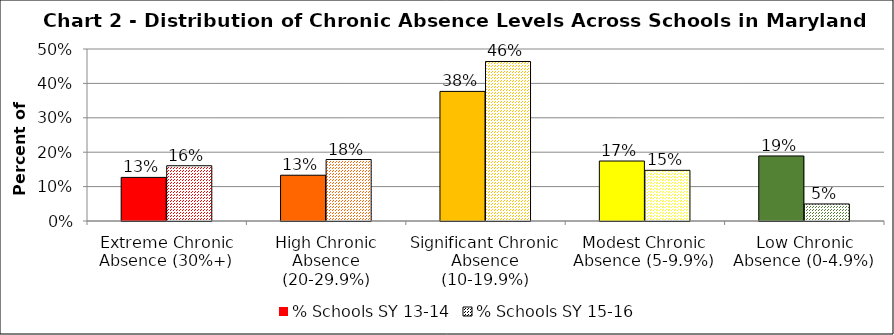
| Category | % Schools SY 13-14 | % Schools SY 15-16 |
|---|---|---|
| Extreme Chronic Absence (30%+) | 0.127 | 0.161 |
| High Chronic Absence (20-29.9%) | 0.133 | 0.179 |
| Significant Chronic Absence (10-19.9%) | 0.377 | 0.464 |
| Modest Chronic Absence (5-9.9%) | 0.174 | 0.147 |
| Low Chronic Absence (0-4.9%) | 0.189 | 0.05 |